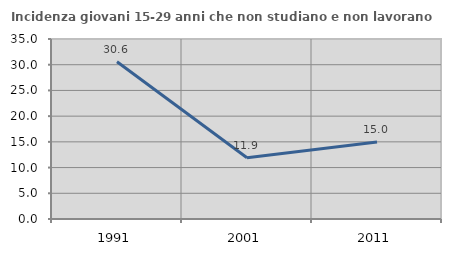
| Category | Incidenza giovani 15-29 anni che non studiano e non lavorano  |
|---|---|
| 1991.0 | 30.563 |
| 2001.0 | 11.919 |
| 2011.0 | 14.952 |